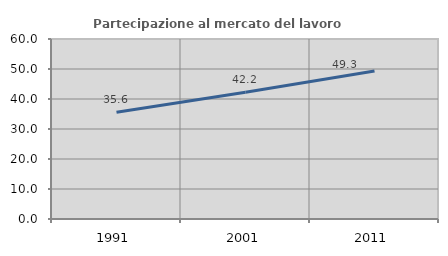
| Category | Partecipazione al mercato del lavoro  femminile |
|---|---|
| 1991.0 | 35.596 |
| 2001.0 | 42.222 |
| 2011.0 | 49.331 |